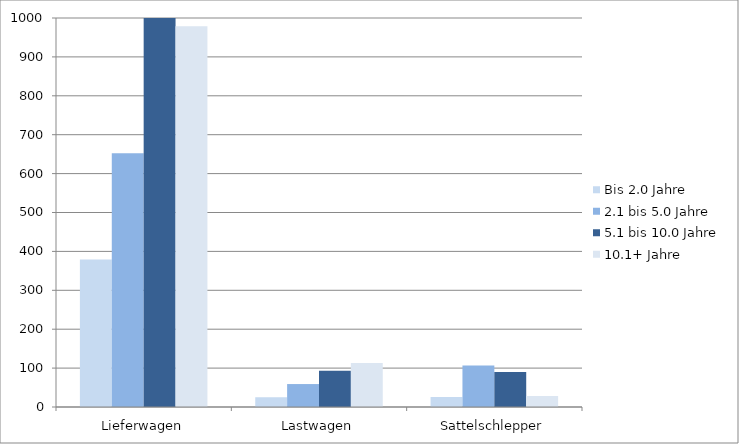
| Category | Bis 2.0 Jahre | 2.1 bis 5.0 Jahre | 5.1 bis 10.0 Jahre | 10.1+ Jahre |
|---|---|---|---|---|
| Lieferwagen | 379 | 652 | 1079 | 979 |
| Lastwagen | 25 | 59 | 93 | 113 |
| Sattelschlepper | 26 | 107 | 90 | 28 |